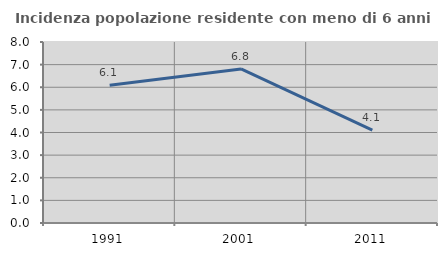
| Category | Incidenza popolazione residente con meno di 6 anni |
|---|---|
| 1991.0 | 6.084 |
| 2001.0 | 6.81 |
| 2011.0 | 4.108 |